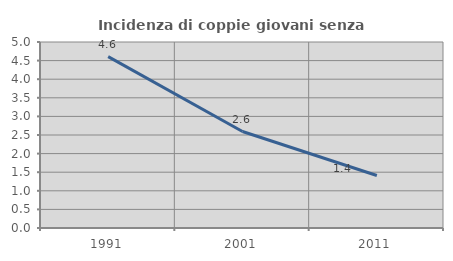
| Category | Incidenza di coppie giovani senza figli |
|---|---|
| 1991.0 | 4.607 |
| 2001.0 | 2.594 |
| 2011.0 | 1.412 |